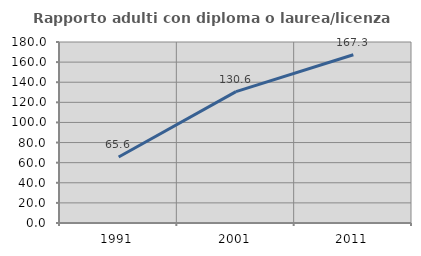
| Category | Rapporto adulti con diploma o laurea/licenza media  |
|---|---|
| 1991.0 | 65.646 |
| 2001.0 | 130.597 |
| 2011.0 | 167.305 |